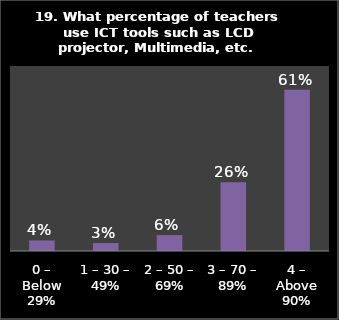
| Category | Series 0 |
|---|---|
| 0 – Below 29% | 0.04 |
| 1 – 30 – 49% | 0.03 |
| 2 – 50 – 69% | 0.06 |
| 3 – 70 – 89% | 0.26 |
| 4 – Above 90% | 0.61 |